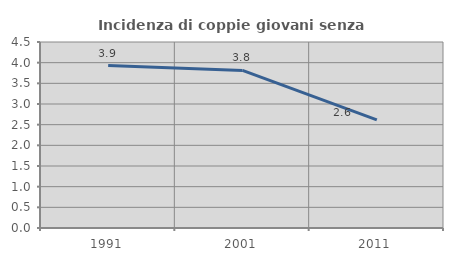
| Category | Incidenza di coppie giovani senza figli |
|---|---|
| 1991.0 | 3.929 |
| 2001.0 | 3.812 |
| 2011.0 | 2.617 |